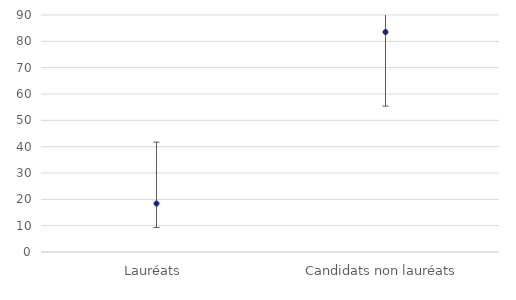
| Category | Series 0 |
|---|---|
| Lauréats | 18.41 |
| Candidats non lauréats | 83.53 |